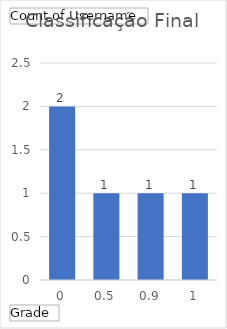
| Category | Total |
|---|---|
| 0 | 2 |
| 0.5 | 1 |
| 0.9 | 1 |
| 1 | 1 |